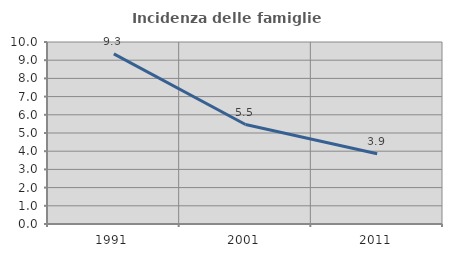
| Category | Incidenza delle famiglie numerose |
|---|---|
| 1991.0 | 9.349 |
| 2001.0 | 5.467 |
| 2011.0 | 3.86 |